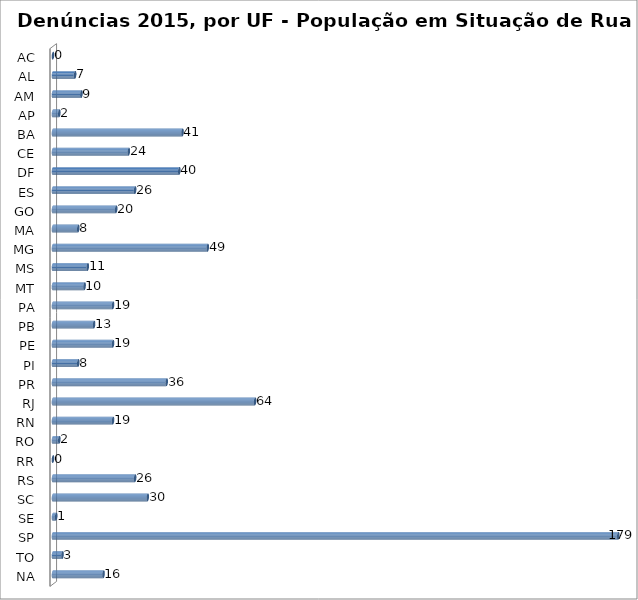
| Category | Series 0 |
|---|---|
| AC | 0 |
| AL | 7 |
| AM | 9 |
| AP | 2 |
| BA | 41 |
| CE | 24 |
| DF | 40 |
| ES | 26 |
| GO | 20 |
| MA | 8 |
| MG | 49 |
| MS | 11 |
| MT | 10 |
| PA | 19 |
| PB | 13 |
| PE | 19 |
| PI | 8 |
| PR | 36 |
| RJ | 64 |
| RN | 19 |
| RO | 2 |
| RR | 0 |
| RS | 26 |
| SC | 30 |
| SE | 1 |
| SP | 179 |
| TO | 3 |
| NA | 16 |